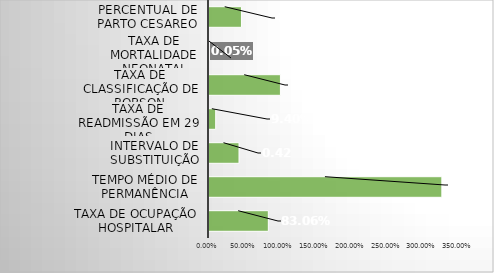
| Category | Series 0 |
|---|---|
| Taxa de Ocupação Hospitalar | 0.831 |
| Tempo Médio de permanência | 3.26 |
| Intervalo de substituição | 0.42 |
| Taxa de readmissão em 29 dias | 0.094 |
| Taxa de classificação de Robson | 1 |
| Taxa de mortalidade neonatal | 0 |
| Percentual de parto cesareo | 0.454 |